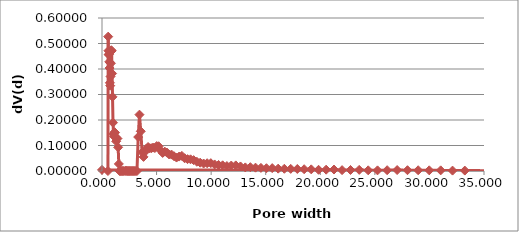
| Category | Series 1 |
|---|---|
| 0.545 | 0 |
| 0.567 | 0.527 |
| 0.59 | 0.472 |
| 0.614 | 0.456 |
| 0.64 | 0.458 |
| 0.666 | 0.428 |
| 0.694 | 0.404 |
| 0.723 | 0.346 |
| 0.753 | 0.335 |
| 0.785 | 0.371 |
| 0.818 | 0.422 |
| 0.852 | 0.474 |
| 0.889 | 0.471 |
| 0.926 | 0.382 |
| 0.966 | 0.291 |
| 1.007 | 0.189 |
| 1.051 | 0.144 |
| 1.096 | 0.136 |
| 1.144 | 0.152 |
| 1.193 | 0.151 |
| 1.245 | 0.134 |
| 1.299 | 0.116 |
| 1.356 | 0.126 |
| 1.416 | 0.127 |
| 1.478 | 0.093 |
| 1.543 | 0.028 |
| 1.611 | 0 |
| 1.682 | 0 |
| 1.756 | 0 |
| 1.834 | 0 |
| 1.915 | 0 |
| 2.0 | 0 |
| 2.1206 | 0 |
| 2.1948 | 0.001 |
| 2.2717 | 0 |
| 2.3512 | 0 |
| 2.4335 | 0 |
| 2.5186 | 0 |
| 2.6068 | 0 |
| 2.698 | 0 |
| 2.7925 | 0 |
| 2.8902 | 0 |
| 2.9914 | 0 |
| 3.0961 | 0 |
| 3.2044 | 0 |
| 3.3166 | 0.133 |
| 3.4326 | 0.221 |
| 3.5528 | 0.156 |
| 3.6771 | 0.074 |
| 3.8058 | 0.055 |
| 3.939 | 0.075 |
| 4.0769 | 0.088 |
| 4.2196 | 0.094 |
| 4.3673 | 0.089 |
| 4.5201 | 0.089 |
| 4.6784 | 0.092 |
| 4.8421 | 0.09 |
| 5.0116 | 0.098 |
| 5.187 | 0.097 |
| 5.369 | 0.081 |
| 5.556 | 0.071 |
| 5.751 | 0.076 |
| 5.952 | 0.072 |
| 6.16 | 0.065 |
| 6.376 | 0.064 |
| 6.599 | 0.058 |
| 6.83 | 0.053 |
| 7.069 | 0.056 |
| 7.317 | 0.059 |
| 7.573 | 0.05 |
| 7.8379 | 0.046 |
| 8.1122 | 0.046 |
| 8.3961 | 0.043 |
| 8.69 | 0.036 |
| 8.9941 | 0.033 |
| 9.3089 | 0.029 |
| 9.6347 | 0.03 |
| 9.972 | 0.031 |
| 10.321 | 0.026 |
| 10.682 | 0.024 |
| 11.056 | 0.022 |
| 11.443 | 0.019 |
| 11.8436 | 0.021 |
| 12.2581 | 0.022 |
| 12.6871 | 0.018 |
| 13.1312 | 0.014 |
| 13.5908 | 0.015 |
| 14.0664 | 0.013 |
| 14.5588 | 0.012 |
| 15.0683 | 0.011 |
| 15.5957 | 0.011 |
| 16.1416 | 0.009 |
| 16.7065 | 0.009 |
| 17.2912 | 0.008 |
| 17.8964 | 0.008 |
| 18.5228 | 0.007 |
| 19.1711 | 0.006 |
| 19.8421 | 0.005 |
| 20.5366 | 0.005 |
| 21.2553 | 0.006 |
| 21.9993 | 0.003 |
| 22.7693 | 0.004 |
| 23.5662 | 0.004 |
| 24.391 | 0.003 |
| 25.2447 | 0.003 |
| 26.1282 | 0.003 |
| 27.0427 | 0.004 |
| 27.9892 | 0.003 |
| 28.9689 | 0.003 |
| 29.9828 | 0.003 |
| 31.0322 | 0.003 |
| 32.1183 | 0.002 |
| 33.2424 | 0.002 |